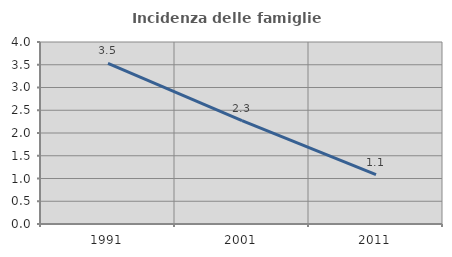
| Category | Incidenza delle famiglie numerose |
|---|---|
| 1991.0 | 3.529 |
| 2001.0 | 2.273 |
| 2011.0 | 1.087 |